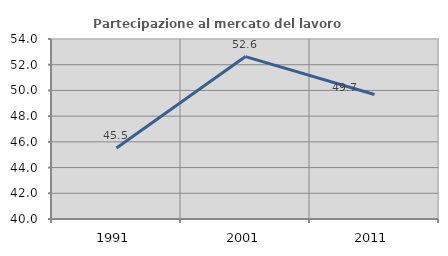
| Category | Partecipazione al mercato del lavoro  femminile |
|---|---|
| 1991.0 | 45.528 |
| 2001.0 | 52.632 |
| 2011.0 | 49.686 |